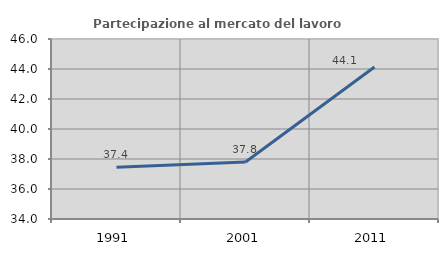
| Category | Partecipazione al mercato del lavoro  femminile |
|---|---|
| 1991.0 | 37.443 |
| 2001.0 | 37.799 |
| 2011.0 | 44.131 |